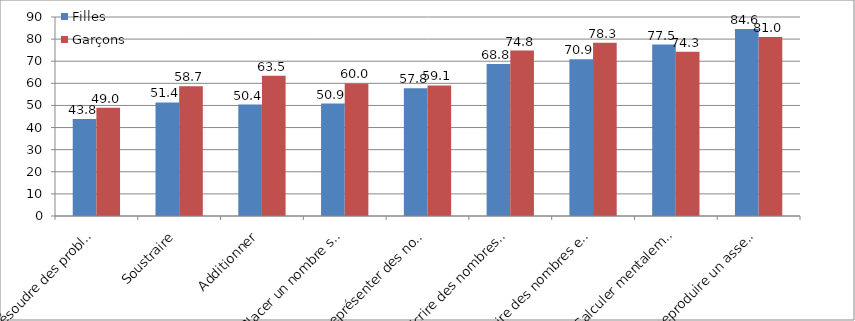
| Category | Filles  | Garçons |
|---|---|---|
| Résoudre des problèmes | 43.84 | 48.95 |
| Soustraire | 51.38 | 58.73 |
| Additionner | 50.41 | 63.45 |
| Placer un nombre sur une ligne numérique | 50.86 | 59.95 |
| Représenter des nombres entiers | 57.8 | 59.07 |
| Ecrire des nombres entiers | 68.79 | 74.82 |
| Lire des nombres entiers | 70.91 | 78.34 |
| Calculer mentalement | 77.52 | 74.34 |
| Reproduire un assemblage | 84.57 | 80.99 |